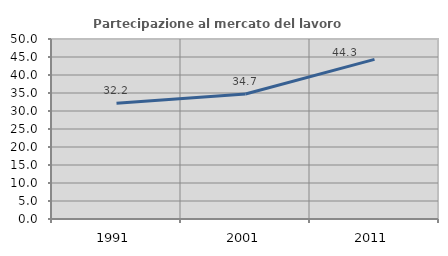
| Category | Partecipazione al mercato del lavoro  femminile |
|---|---|
| 1991.0 | 32.157 |
| 2001.0 | 34.721 |
| 2011.0 | 44.348 |